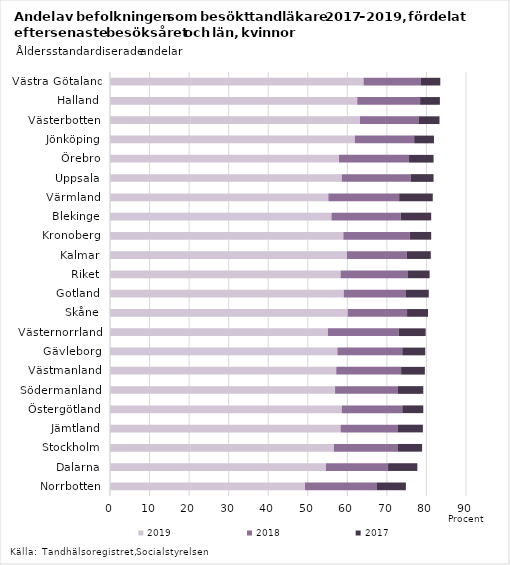
| Category | 2019 | 2018 | 2017 |
|---|---|---|---|
| Norrbotten | 49.3 | 18.2 | 7.3 |
| Dalarna | 54.6 | 15.7 | 7.4 |
| Stockholm | 56.6 | 16.2 | 6.1 |
| Jämtland | 58.3 | 14.5 | 6.3 |
| Östergötland | 58.6 | 15.3 | 5.3 |
| Södermanland | 56.9 | 15.9 | 6.4 |
| Västmanland | 57.2 | 16.4 | 6 |
| Gävleborg | 57.5 | 16.4 | 5.8 |
| Västernorrland | 55.1 | 17.9 | 6.8 |
| Skåne | 60.1 | 15 | 5.3 |
| Gotland | 59.1 | 15.6 | 5.9 |
| Riket | 58.3 | 16.9 | 5.6 |
| Kalmar | 59.9 | 15.1 | 6.1 |
| Kronoberg | 59 | 16.8 | 5.4 |
| Blekinge | 56 | 17.5 | 7.7 |
| Värmland | 55.2 | 17.9 | 8.5 |
| Uppsala | 58.6 | 17.4 | 5.8 |
| Örebro | 57.9 | 17.7 | 6.2 |
| Jönköping | 61.9 | 15 | 5 |
| Västerbotten | 63.2 | 14.8 | 5.3 |
| Halland | 62.5 | 15.9 | 5 |
| Västra Götaland | 64.1 | 14.5 | 4.9 |